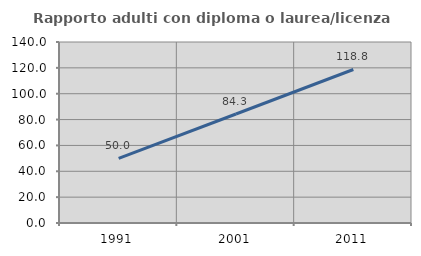
| Category | Rapporto adulti con diploma o laurea/licenza media  |
|---|---|
| 1991.0 | 50 |
| 2001.0 | 84.314 |
| 2011.0 | 118.75 |